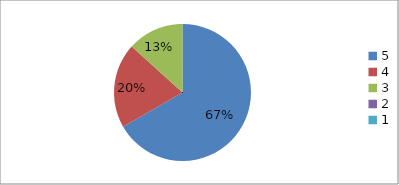
| Category | Series 0 | Series 1 |
|---|---|---|
| 5.0 | 66.7 | 66.7 |
| 4.0 | 20 | 20 |
| 3.0 | 13.3 | 13.3 |
| 2.0 | 0 | 0 |
| 1.0 | 0 | 0 |